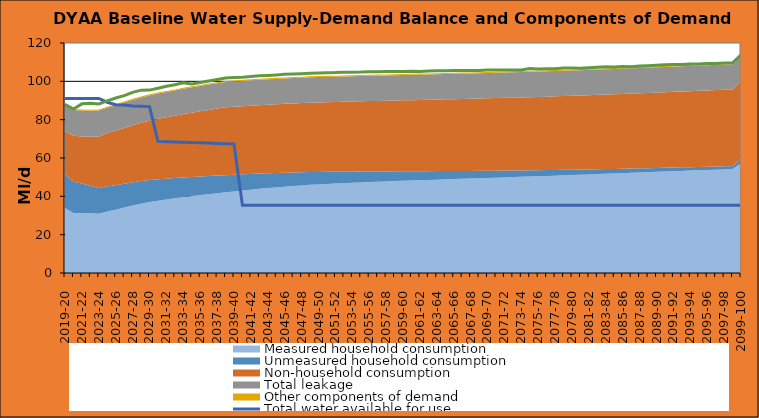
| Category | Total water available for use | Total demand + target headroom (baseline) |
|---|---|---|
| 0 | 91.1 | 87.985 |
| 1 | 91.1 | 85.588 |
| 2 | 91.1 | 88.256 |
| 3 | 91.1 | 88.557 |
| 4 | 91.1 | 88.168 |
| 5 | 89.1 | 89.807 |
| 6 | 87.768 | 91.287 |
| 7 | 87.62 | 92.572 |
| 8 | 87.112 | 94.237 |
| 9 | 86.964 | 95.409 |
| 10 | 86.816 | 95.421 |
| 11 | 68.658 | 96.397 |
| 12 | 68.51 | 97.387 |
| 13 | 68.363 | 98.18 |
| 14 | 68.215 | 99.224 |
| 15 | 68.067 | 98.675 |
| 16 | 67.919 | 99.369 |
| 17 | 67.771 | 100.194 |
| 18 | 67.623 | 100.979 |
| 19 | 67.475 | 101.695 |
| 20 | 67.327 | 101.94 |
| 21 | 35.29 | 102.122 |
| 22 | 35.29 | 102.478 |
| 23 | 35.29 | 102.879 |
| 24 | 35.29 | 103.092 |
| 25 | 35.29 | 103.352 |
| 26 | 35.29 | 103.672 |
| 27 | 35.29 | 103.795 |
| 28 | 35.29 | 103.993 |
| 29 | 35.29 | 104.212 |
| 30 | 35.29 | 104.31 |
| 31 | 35.29 | 104.481 |
| 32 | 35.29 | 104.565 |
| 33 | 35.29 | 104.772 |
| 34 | 35.29 | 104.804 |
| 35 | 35.29 | 104.808 |
| 36 | 35.29 | 104.98 |
| 37 | 35.29 | 104.997 |
| 38 | 35.29 | 105.079 |
| 39 | 35.29 | 105.101 |
| 40 | 35.29 | 105.121 |
| 41 | 35.29 | 105.242 |
| 42 | 35.29 | 105.164 |
| 43 | 35.29 | 105.441 |
| 44 | 35.29 | 105.476 |
| 45 | 35.29 | 105.543 |
| 46 | 35.29 | 105.61 |
| 47 | 35.29 | 105.635 |
| 48 | 35.29 | 105.698 |
| 49 | 35.29 | 105.677 |
| 50 | 35.29 | 105.92 |
| 51 | 35.29 | 105.928 |
| 52 | 35.29 | 105.914 |
| 53 | 35.29 | 105.909 |
| 54 | 35.29 | 105.964 |
| 55 | 35.29 | 106.632 |
| 56 | 35.29 | 106.425 |
| 57 | 35.29 | 106.524 |
| 58 | 35.29 | 106.573 |
| 59 | 35.29 | 106.903 |
| 60 | 35.29 | 106.904 |
| 61 | 35.29 | 106.847 |
| 62 | 35.29 | 107.091 |
| 63 | 35.29 | 107.294 |
| 64 | 35.29 | 107.581 |
| 65 | 35.29 | 107.522 |
| 66 | 35.29 | 107.708 |
| 67 | 35.29 | 107.647 |
| 68 | 35.29 | 107.941 |
| 69 | 35.29 | 108.143 |
| 70 | 35.29 | 108.399 |
| 71 | 35.29 | 108.705 |
| 72 | 35.29 | 108.729 |
| 73 | 35.29 | 108.757 |
| 74 | 35.29 | 109.064 |
| 75 | 35.29 | 109.054 |
| 76 | 35.29 | 109.261 |
| 77 | 35.29 | 109.293 |
| 78 | 35.29 | 109.611 |
| 79 | 35.29 | 109.694 |
| 80 | 35.29 | 113.802 |